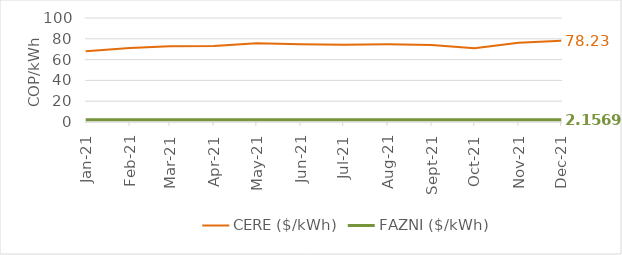
| Category | CERE ($/kWh) | FAZNI ($/kWh) |
|---|---|---|
| 2021-01-01 | 68.118 | 2.157 |
| 2021-02-01 | 71.256 | 2.157 |
| 2021-03-01 | 72.822 | 2.157 |
| 2021-04-01 | 73.127 | 2.157 |
| 2021-05-01 | 75.701 | 2.157 |
| 2021-06-01 | 74.847 | 2.157 |
| 2021-07-01 | 74.385 | 2.157 |
| 2021-08-01 | 74.665 | 2.157 |
| 2021-09-01 | 74.127 | 2.157 |
| 2021-10-01 | 70.924 | 2.157 |
| 2021-11-01 | 76.313 | 2.157 |
| 2021-12-01 | 78.235 | 2.157 |